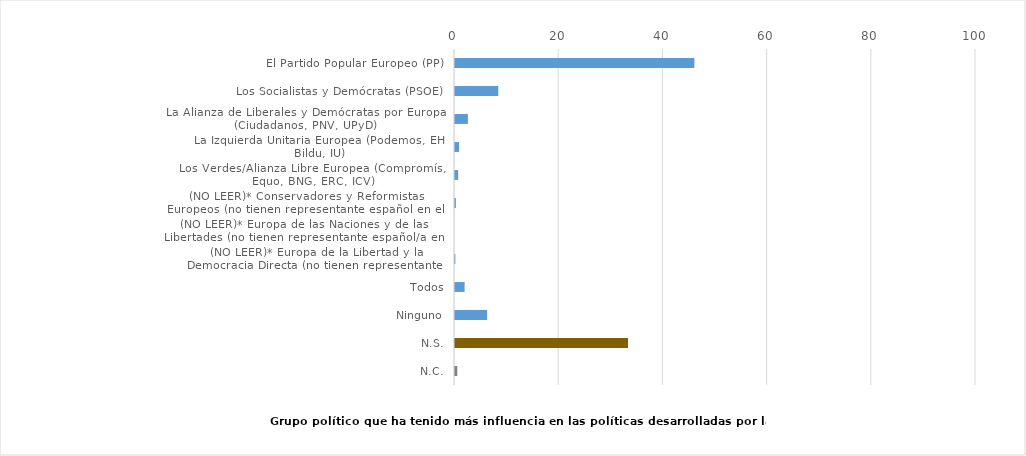
| Category | Series 0 |
|---|---|
| El Partido Popular Europeo (PP) | 45.945 |
| Los Socialistas y Demócratas (PSOE) | 8.311 |
| La Alianza de Liberales y Demócratas por Europa (Ciudadanos, PNV, UPyD) | 2.48 |
| La Izquierda Unitaria Europea (Podemos, EH Bildu, IU) | 0.771 |
| Los Verdes/Alianza Libre Europea (Compromís, Equo, BNG, ERC, ICV) | 0.603 |
| (NO LEER)* Conservadores y Reformistas Europeos (no tienen representante español en el PE) | 0.168 |
| (NO LEER)* Europa de las Naciones y de las Libertades (no tienen representante español/​a en el PE) | 0 |
| (NO LEER)* Europa de la Libertad y la Democracia Directa (no tienen representante español en el PE) | 0.067 |
| Todos | 1.843 |
| Ninguno | 6.166 |
| N.S. | 33.21 |
| N.C. | 0.436 |